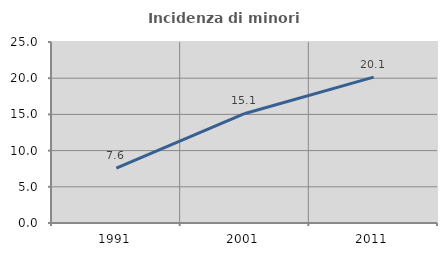
| Category | Incidenza di minori stranieri |
|---|---|
| 1991.0 | 7.595 |
| 2001.0 | 15.128 |
| 2011.0 | 20.148 |